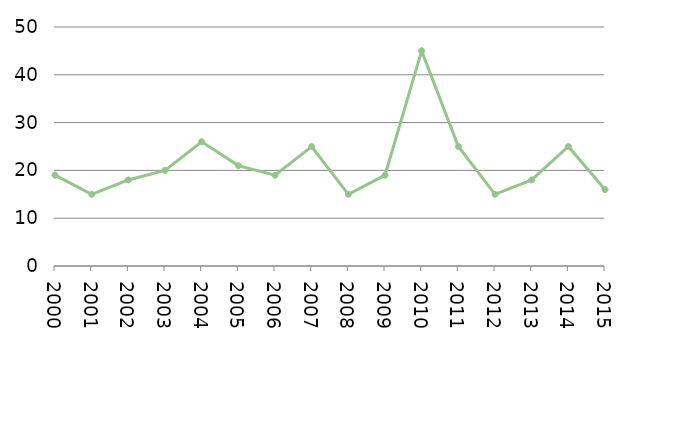
| Category | Avlidna |
|---|---|
| 2000.0 | 19 |
| 2001.0 | 15 |
| 2002.0 | 18 |
| 2003.0 | 20 |
| 2004.0 | 26 |
| 2005.0 | 21 |
| 2006.0 | 19 |
| 2007.0 | 25 |
| 2008.0 | 15 |
| 2009.0 | 19 |
| 2010.0 | 45 |
| 2011.0 | 25 |
| 2012.0 | 15 |
| 2013.0 | 18 |
| 2014.0 | 25 |
| 2015.0 | 16 |